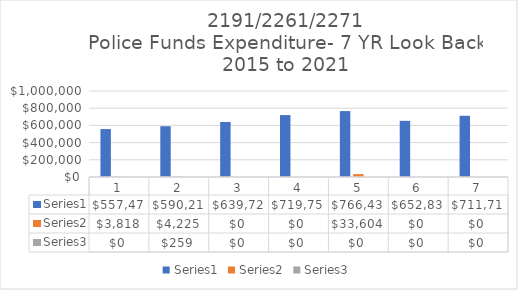
| Category | Series 0 | Series 1 | Series 2 |
|---|---|---|---|
| 0 | 557478 | 3818 | 0 |
| 1 | 590219 | 4225 | 259 |
| 2 | 639720 | 0 | 0 |
| 3 | 719757 | 0 | 0 |
| 4 | 766434 | 33604 | 0 |
| 5 | 652830 | 0 | 0 |
| 6 | 711718 | 0 | 0 |